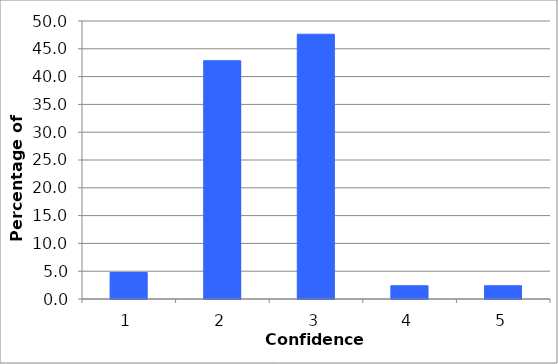
| Category | Pre-Session |
|---|---|
| 1.0 | 4.762 |
| 2.0 | 42.857 |
| 3.0 | 47.619 |
| 4.0 | 2.381 |
| 5.0 | 2.381 |